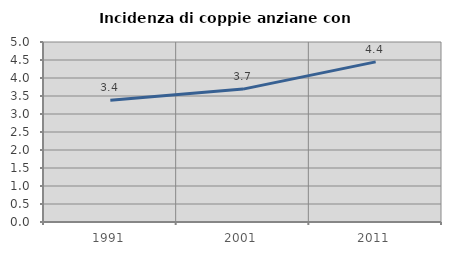
| Category | Incidenza di coppie anziane con figli |
|---|---|
| 1991.0 | 3.381 |
| 2001.0 | 3.691 |
| 2011.0 | 4.449 |